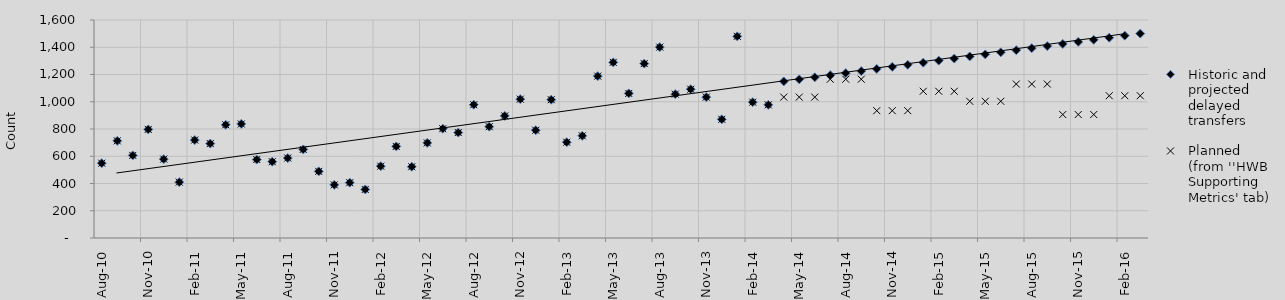
| Category | Historic and projected delayed transfers | Planned (from ''HWB Supporting Metrics' tab) |
|---|---|---|
| 2010-08-01 | 549 | 549 |
| 2010-09-01 | 713 | 713 |
| 2010-10-01 | 606 | 606 |
| 2010-11-01 | 797 | 797 |
| 2010-12-01 | 579 | 579 |
| 2011-01-01 | 410 | 410 |
| 2011-02-01 | 719 | 719 |
| 2011-03-01 | 693 | 693 |
| 2011-04-01 | 831 | 831 |
| 2011-05-01 | 837 | 837 |
| 2011-06-01 | 576 | 576 |
| 2011-07-01 | 560 | 560 |
| 2011-08-01 | 587 | 587 |
| 2011-09-01 | 650 | 650 |
| 2011-10-01 | 489 | 489 |
| 2011-11-01 | 390 | 390 |
| 2011-12-01 | 406 | 406 |
| 2012-01-01 | 356 | 356 |
| 2012-02-01 | 527 | 527 |
| 2012-03-01 | 672 | 672 |
| 2012-04-01 | 523 | 523 |
| 2012-05-01 | 698 | 698 |
| 2012-06-01 | 802 | 802 |
| 2012-07-01 | 774 | 774 |
| 2012-08-01 | 978 | 978 |
| 2012-09-01 | 817 | 817 |
| 2012-10-01 | 896 | 896 |
| 2012-11-01 | 1019 | 1019 |
| 2012-12-01 | 791 | 791 |
| 2013-01-01 | 1015 | 1015 |
| 2013-02-01 | 703 | 703 |
| 2013-03-01 | 750 | 750 |
| 2013-04-01 | 1188 | 1188 |
| 2013-05-01 | 1289 | 1289 |
| 2013-06-01 | 1061 | 1061 |
| 2013-07-01 | 1280 | 1280 |
| 2013-08-01 | 1401 | 1401 |
| 2013-09-01 | 1056 | 1056 |
| 2013-10-01 | 1092 | 1092 |
| 2013-11-01 | 1034 | 1034 |
| 2013-12-01 | 871 | 871 |
| 2014-01-01 | 1480 | 1480 |
| 2014-02-01 | 997 | 997 |
| 2014-03-01 | 977 | 977 |
| 2014-04-01 | 1149.057 | 1034 |
| 2014-05-01 | 1164.329 | 1034 |
| 2014-06-01 | 1179.602 | 1034 |
| 2014-07-01 | 1194.874 | 1165.26 |
| 2014-08-01 | 1210.146 | 1165.26 |
| 2014-09-01 | 1225.418 | 1165.26 |
| 2014-10-01 | 1240.69 | 934.516 |
| 2014-11-01 | 1255.963 | 934.516 |
| 2014-12-01 | 1271.235 | 934.516 |
| 2015-01-01 | 1286.507 | 1077.016 |
| 2015-02-01 | 1301.779 | 1077.016 |
| 2015-03-01 | 1317.052 | 1077.016 |
| 2015-04-01 | 1332.324 | 1003.333 |
| 2015-05-01 | 1347.596 | 1003.333 |
| 2015-06-01 | 1362.868 | 1003.333 |
| 2015-07-01 | 1378.141 | 1129.867 |
| 2015-08-01 | 1393.413 | 1129.867 |
| 2015-09-01 | 1408.685 | 1129.867 |
| 2015-10-01 | 1423.957 | 906.131 |
| 2015-11-01 | 1439.23 | 906.131 |
| 2015-12-01 | 1454.502 | 906.131 |
| 2016-01-01 | 1469.774 | 1044.303 |
| 2016-02-01 | 1485.046 | 1044.303 |
| 2016-03-01 | 1500.318 | 1044.303 |